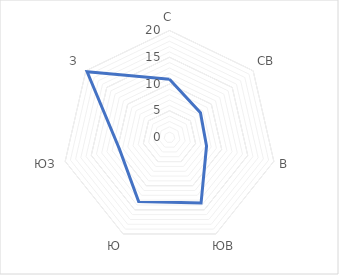
| Category | Series 0 |
|---|---|
| С | 10.9 |
| СВ | 7.4 |
| В | 7.1 |
| ЮВ | 13.6 |
| Ю | 13.3 |
| ЮЗ | 9.6 |
| З | 19.7 |